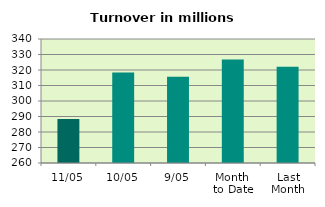
| Category | Series 0 |
|---|---|
| 11/05 | 288.417 |
| 10/05 | 318.376 |
| 9/05 | 315.65 |
| Month 
to Date | 326.816 |
| Last
Month | 322.024 |